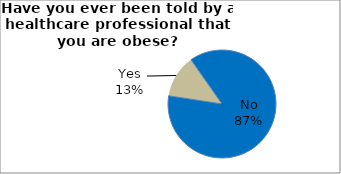
| Category | Series 0 |
|---|---|
| No | 87.155 |
| Yes | 12.845 |